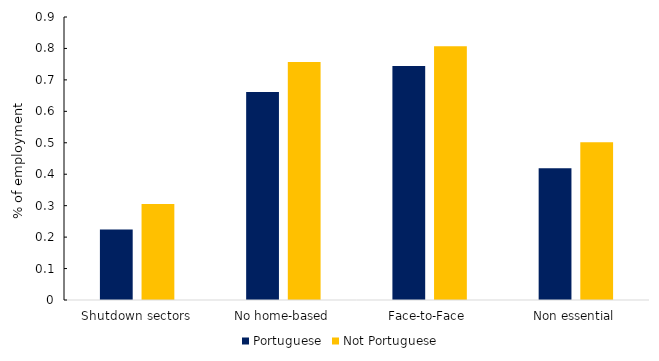
| Category | Portuguese | Not Portuguese |
|---|---|---|
| Shutdown sectors | 0.224 | 0.305 |
| No home-based | 0.662 | 0.756 |
| Face-to-Face  | 0.744 | 0.807 |
| Non essential | 0.419 | 0.502 |